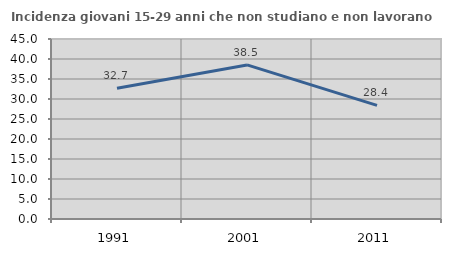
| Category | Incidenza giovani 15-29 anni che non studiano e non lavorano  |
|---|---|
| 1991.0 | 32.683 |
| 2001.0 | 38.518 |
| 2011.0 | 28.396 |